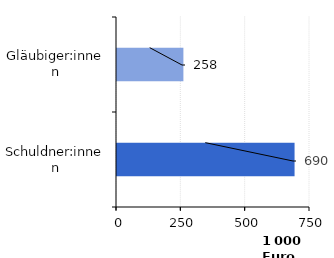
| Category | Series 0 |
|---|---|
| Gläubiger:innen | 258 |
| Schuldner:innen | 690 |